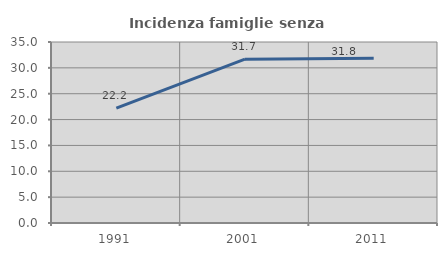
| Category | Incidenza famiglie senza nuclei |
|---|---|
| 1991.0 | 22.222 |
| 2001.0 | 31.672 |
| 2011.0 | 31.841 |